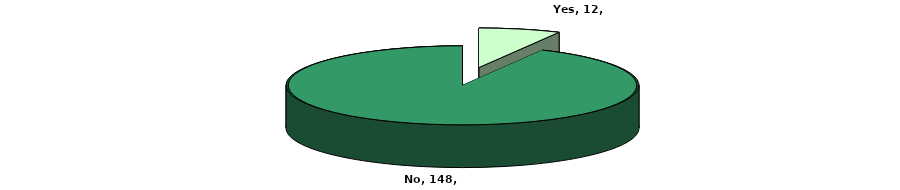
| Category | Series 0 |
|---|---|
| Yes | 12 |
| No | 148 |